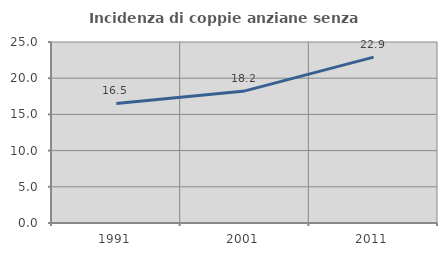
| Category | Incidenza di coppie anziane senza figli  |
|---|---|
| 1991.0 | 16.52 |
| 2001.0 | 18.246 |
| 2011.0 | 22.906 |